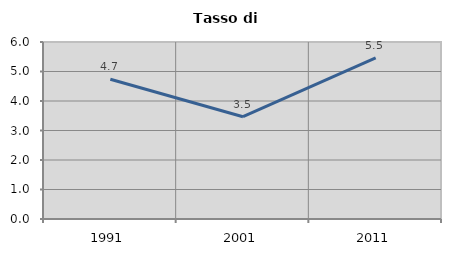
| Category | Tasso di disoccupazione   |
|---|---|
| 1991.0 | 4.735 |
| 2001.0 | 3.468 |
| 2011.0 | 5.463 |